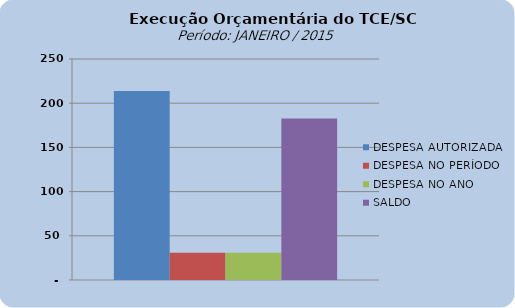
| Category | DESPESA AUTORIZADA | DESPESA NO PERÍODO | DESPESA NO ANO | SALDO |
|---|---|---|---|---|
| 0 | 213723422.34 | 30959990.98 | 30959990.98 | 182763431.36 |